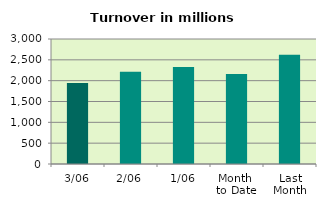
| Category | Series 0 |
|---|---|
| 3/06 | 1944.724 |
| 2/06 | 2215.528 |
| 1/06 | 2328.463 |
| Month 
to Date | 2162.905 |
| Last
Month | 2619.784 |